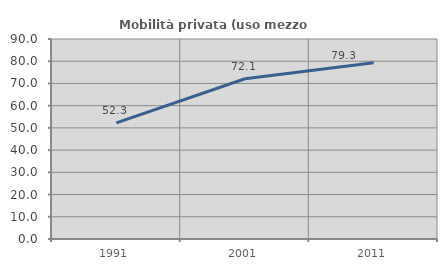
| Category | Mobilità privata (uso mezzo privato) |
|---|---|
| 1991.0 | 52.267 |
| 2001.0 | 72.11 |
| 2011.0 | 79.262 |